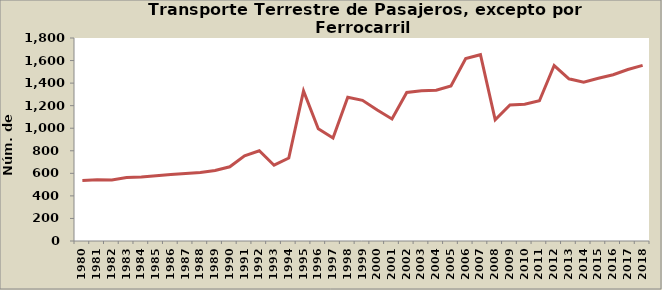
| Category | Series 0 |
|---|---|
| 1980.0 | 537 |
| 1981.0 | 543 |
| 1982.0 | 541 |
| 1983.0 | 563 |
| 1984.0 | 568 |
| 1985.0 | 579 |
| 1986.0 | 589 |
| 1987.0 | 599 |
| 1988.0 | 607 |
| 1989.0 | 625 |
| 1990.0 | 658 |
| 1991.0 | 755 |
| 1992.0 | 800 |
| 1993.0 | 672 |
| 1994.0 | 736 |
| 1995.0 | 1331 |
| 1996.0 | 996 |
| 1997.0 | 914 |
| 1998.0 | 1275 |
| 1999.0 | 1247 |
| 2000.0 | 1161 |
| 2001.0 | 1082 |
| 2002.0 | 1317 |
| 2003.0 | 1333 |
| 2004.0 | 1337 |
| 2005.0 | 1375 |
| 2006.0 | 1617 |
| 2007.0 | 1652 |
| 2008.0 | 1075 |
| 2009.0 | 1207 |
| 2010.0 | 1213 |
| 2011.0 | 1243 |
| 2012.0 | 1556 |
| 2013.0 | 1438 |
| 2014.0 | 1409 |
| 2015.0 | 1443 |
| 2016.0 | 1474 |
| 2017.0 | 1521 |
| 2018.0 | 1557 |